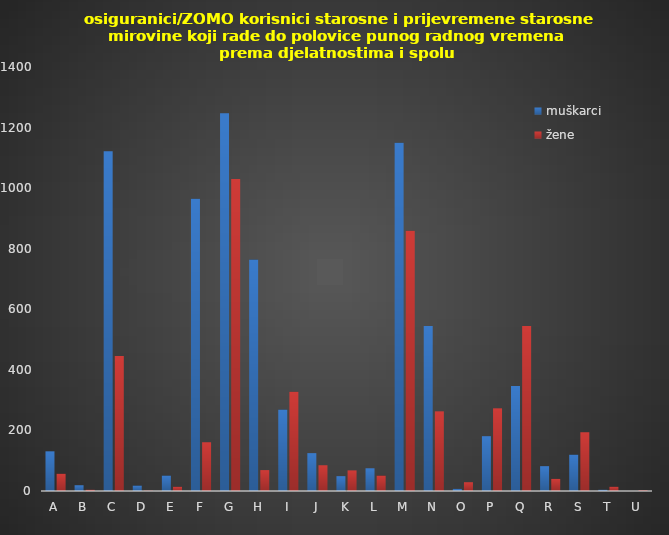
| Category | muškarci | žene |
|---|---|---|
| A | 131 | 57 |
| B | 19 | 4 |
| C | 1122 | 446 |
| D | 18 | 1 |
| E | 51 | 14 |
| F | 965 | 161 |
| G | 1247 | 1030 |
| H | 764 | 69 |
| I | 269 | 328 |
| J | 125 | 85 |
| K | 49 | 68 |
| L | 75 | 51 |
| M | 1150 | 859 |
| N | 545 | 263 |
| O | 7 | 29 |
| P | 181 | 273 |
| Q | 347 | 545 |
| R | 82 | 40 |
| S | 120 | 194 |
| T | 4 | 14 |
| U | 0 | 2 |